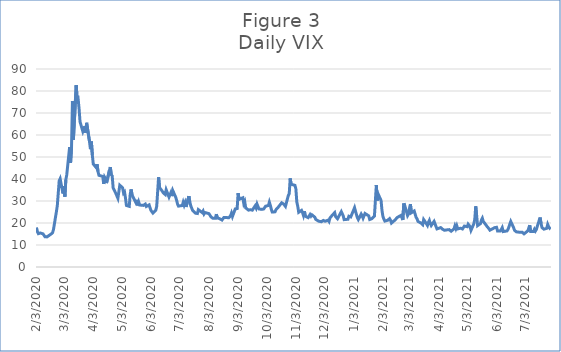
| Category | Series 0 |
|---|---|
| 2/3/20 | 17.97 |
| 2/4/20 | 16.05 |
| 2/5/20 | 15.15 |
| 2/6/20 | 14.96 |
| 2/7/20 | 15.47 |
| 2/10/20 | 15.04 |
| 2/11/20 | 15.18 |
| 2/12/20 | 13.74 |
| 2/13/20 | 14.15 |
| 2/14/20 | 13.68 |
| 2/18/20 | 14.83 |
| 2/19/20 | 14.38 |
| 2/20/20 | 15.56 |
| 2/21/20 | 17.08 |
| 2/24/20 | 25.03 |
| 2/25/20 | 27.85 |
| 2/26/20 | 27.56 |
| 2/27/20 | 39.16 |
| 2/28/20 | 40.11 |
| 3/2/20 | 33.42 |
| 3/3/20 | 36.82 |
| 3/4/20 | 31.99 |
| 3/5/20 | 39.62 |
| 3/6/20 | 41.94 |
| 3/9/20 | 54.46 |
| 3/10/20 | 47.3 |
| 3/11/20 | 53.9 |
| 3/12/20 | 75.47 |
| 3/13/20 | 57.83 |
| 3/16/20 | 82.69 |
| 3/17/20 | 75.91 |
| 3/18/20 | 76.45 |
| 3/19/20 | 72 |
| 3/20/20 | 66.04 |
| 3/23/20 | 61.59 |
| 3/24/20 | 61.67 |
| 3/25/20 | 63.95 |
| 3/26/20 | 61 |
| 3/27/20 | 65.54 |
| 3/30/20 | 57.08 |
| 3/31/20 | 53.54 |
| 4/1/20 | 57.06 |
| 4/2/20 | 50.91 |
| 4/3/20 | 46.8 |
| 4/6/20 | 45.24 |
| 4/7/20 | 46.7 |
| 4/8/20 | 43.35 |
| 4/9/20 | 41.67 |
| 4/13/20 | 41.17 |
| 4/14/20 | 37.76 |
| 4/15/20 | 40.84 |
| 4/16/20 | 40.11 |
| 4/17/20 | 38.15 |
| 4/20/20 | 43.83 |
| 4/21/20 | 45.41 |
| 4/22/20 | 41.98 |
| 4/23/20 | 41.38 |
| 4/24/20 | 35.93 |
| 4/27/20 | 33.29 |
| 4/28/20 | 33.57 |
| 4/29/20 | 31.23 |
| 4/30/20 | 34.15 |
| 5/1/20 | 37.19 |
| 5/4/20 | 35.97 |
| 5/5/20 | 33.61 |
| 5/6/20 | 34.12 |
| 5/7/20 | 31.44 |
| 5/8/20 | 27.98 |
| 5/11/20 | 27.57 |
| 5/12/20 | 33.04 |
| 5/13/20 | 35.28 |
| 5/14/20 | 32.61 |
| 5/15/20 | 31.89 |
| 5/18/20 | 29.3 |
| 5/19/20 | 30.53 |
| 5/20/20 | 27.99 |
| 5/21/20 | 29.53 |
| 5/22/20 | 28.16 |
| 5/26/20 | 28.01 |
| 5/27/20 | 27.62 |
| 5/28/20 | 28.59 |
| 5/29/20 | 27.51 |
| 6/1/20 | 28.23 |
| 6/2/20 | 26.84 |
| 6/3/20 | 25.66 |
| 6/4/20 | 25.81 |
| 6/5/20 | 24.52 |
| 6/8/20 | 25.81 |
| 6/9/20 | 27.57 |
| 6/10/20 | 27.57 |
| 6/11/20 | 40.79 |
| 6/12/20 | 36.09 |
| 6/15/20 | 34.4 |
| 6/16/20 | 33.67 |
| 6/17/20 | 33.47 |
| 6/18/20 | 32.94 |
| 6/19/20 | 35.12 |
| 6/22/20 | 31.77 |
| 6/23/20 | 31.37 |
| 6/24/20 | 33.84 |
| 6/25/20 | 32.22 |
| 6/26/20 | 34.73 |
| 6/29/20 | 31.78 |
| 6/30/20 | 30.43 |
| 7/1/20 | 28.62 |
| 7/2/20 | 27.68 |
| 7/6/20 | 27.94 |
| 7/7/20 | 29.43 |
| 7/8/20 | 28.08 |
| 7/9/20 | 29.26 |
| 7/10/20 | 27.29 |
| 7/13/20 | 32.19 |
| 7/14/20 | 29.52 |
| 7/15/20 | 27.76 |
| 7/16/20 | 28 |
| 7/17/20 | 25.68 |
| 7/20/20 | 24.46 |
| 7/21/20 | 24.84 |
| 7/22/20 | 24.32 |
| 7/23/20 | 26.08 |
| 7/24/20 | 25.84 |
| 7/27/20 | 24.74 |
| 7/28/20 | 25.44 |
| 7/29/20 | 24.1 |
| 7/30/20 | 24.76 |
| 7/31/20 | 24.46 |
| 8/3/20 | 24.28 |
| 8/4/20 | 23.76 |
| 8/5/20 | 22.99 |
| 8/6/20 | 22.65 |
| 8/7/20 | 22.21 |
| 8/10/20 | 22.13 |
| 8/11/20 | 24.03 |
| 8/12/20 | 22.28 |
| 8/13/20 | 22.13 |
| 8/14/20 | 22.05 |
| 8/17/20 | 21.35 |
| 8/18/20 | 21.51 |
| 8/19/20 | 22.54 |
| 8/20/20 | 22.72 |
| 8/21/20 | 22.54 |
| 8/24/20 | 22.37 |
| 8/25/20 | 22.03 |
| 8/26/20 | 23.27 |
| 8/27/20 | 24.47 |
| 8/28/20 | 22.96 |
| 8/31/20 | 26.41 |
| 9/1/20 | 26.12 |
| 9/2/20 | 26.57 |
| 9/3/20 | 33.6 |
| 9/4/20 | 30.75 |
| 9/8/20 | 31.46 |
| 9/9/20 | 28.81 |
| 9/10/20 | 29.71 |
| 9/11/20 | 26.87 |
| 9/14/20 | 25.85 |
| 9/15/20 | 25.59 |
| 9/16/20 | 26.04 |
| 9/17/20 | 26.46 |
| 9/18/20 | 25.83 |
| 9/21/20 | 27.78 |
| 9/22/20 | 26.86 |
| 9/23/20 | 28.58 |
| 9/24/20 | 28.51 |
| 9/25/20 | 26.38 |
| 9/28/20 | 26.19 |
| 9/29/20 | 26.27 |
| 9/30/20 | 26.37 |
| 10/1/20 | 26.7 |
| 10/2/20 | 27.63 |
| 10/5/20 | 27.96 |
| 10/6/20 | 29.48 |
| 10/7/20 | 28.06 |
| 10/8/20 | 26.36 |
| 10/9/20 | 25 |
| 10/12/20 | 25.07 |
| 10/13/20 | 26.07 |
| 10/14/20 | 26.4 |
| 10/15/20 | 26.97 |
| 10/16/20 | 27.41 |
| 10/19/20 | 29.18 |
| 10/20/20 | 29.35 |
| 10/21/20 | 28.65 |
| 10/22/20 | 28.11 |
| 10/23/20 | 27.55 |
| 10/26/20 | 32.46 |
| 10/27/20 | 33.35 |
| 10/28/20 | 40.28 |
| 10/29/20 | 37.59 |
| 10/30/20 | 38.02 |
| 11/2/20 | 37.13 |
| 11/3/20 | 35.55 |
| 11/4/20 | 29.57 |
| 11/5/20 | 27.58 |
| 11/6/20 | 24.86 |
| 11/9/20 | 25.75 |
| 11/10/20 | 24.8 |
| 11/11/20 | 23.45 |
| 11/12/20 | 25.35 |
| 11/13/20 | 23.1 |
| 11/16/20 | 22.45 |
| 11/17/20 | 22.71 |
| 11/18/20 | 23.84 |
| 11/19/20 | 23.11 |
| 11/20/20 | 23.7 |
| 11/23/20 | 22.66 |
| 11/24/20 | 21.64 |
| 11/25/20 | 21.25 |
| 11/27/20 | 20.84 |
| 11/30/20 | 20.57 |
| 12/1/20 | 20.77 |
| 12/2/20 | 21.17 |
| 12/3/20 | 21.28 |
| 12/4/20 | 20.79 |
| 12/7/20 | 21.3 |
| 12/8/20 | 20.68 |
| 12/9/20 | 22.27 |
| 12/10/20 | 22.52 |
| 12/11/20 | 23.31 |
| 12/14/20 | 24.72 |
| 12/15/20 | 22.89 |
| 12/16/20 | 22.5 |
| 12/17/20 | 21.93 |
| 12/18/20 | 21.57 |
| 12/21/20 | 25.16 |
| 12/22/20 | 24.23 |
| 12/23/20 | 23.31 |
| 12/24/20 | 21.53 |
| 12/28/20 | 21.7 |
| 12/29/20 | 23.08 |
| 12/30/20 | 22.77 |
| 12/31/20 | 22.75 |
| 1/4/21 | 26.97 |
| 1/5/21 | 25.34 |
| 1/6/21 | 25.07 |
| 1/7/21 | 22.37 |
| 1/8/21 | 21.56 |
| 1/11/21 | 24.08 |
| 1/12/21 | 23.33 |
| 1/13/21 | 22.21 |
| 1/14/21 | 23.25 |
| 1/15/21 | 24.34 |
| 1/19/21 | 23.24 |
| 1/20/21 | 21.58 |
| 1/21/21 | 21.32 |
| 1/22/21 | 21.91 |
| 1/25/21 | 23.19 |
| 1/26/21 | 23.02 |
| 1/27/21 | 37.21 |
| 1/28/21 | 30.21 |
| 1/29/21 | 33.09 |
| 2/1/21 | 30.24 |
| 2/2/21 | 25.56 |
| 2/3/21 | 22.91 |
| 2/4/21 | 21.77 |
| 2/5/21 | 20.87 |
| 2/8/21 | 21.24 |
| 2/9/21 | 21.63 |
| 2/10/21 | 21.99 |
| 2/11/21 | 21.25 |
| 2/12/21 | 19.97 |
| 2/16/21 | 21.46 |
| 2/17/21 | 21.5 |
| 2/18/21 | 22.49 |
| 2/19/21 | 22.05 |
| 2/22/21 | 23.45 |
| 2/23/21 | 23.11 |
| 2/24/21 | 21.34 |
| 2/25/21 | 28.89 |
| 2/26/21 | 27.95 |
| 3/1/21 | 23.35 |
| 3/2/21 | 24.1 |
| 3/3/21 | 26.67 |
| 3/4/21 | 28.57 |
| 3/5/21 | 24.66 |
| 3/8/21 | 25.47 |
| 3/9/21 | 24.03 |
| 3/10/21 | 22.56 |
| 3/11/21 | 21.91 |
| 3/12/21 | 20.69 |
| 3/15/21 | 20.03 |
| 3/16/21 | 19.79 |
| 3/17/21 | 19.23 |
| 3/18/21 | 21.58 |
| 3/19/21 | 20.95 |
| 3/22/21 | 18.88 |
| 3/23/21 | 20.3 |
| 3/24/21 | 21.2 |
| 3/25/21 | 19.81 |
| 3/26/21 | 18.86 |
| 3/29/21 | 20.74 |
| 3/30/21 | 19.61 |
| 3/31/21 | 19.4 |
| 4/1/21 | 17.33 |
| 4/5/21 | 17.91 |
| 4/6/21 | 18.12 |
| 4/7/21 | 17.16 |
| 4/8/21 | 16.95 |
| 4/9/21 | 16.69 |
| 4/12/21 | 16.91 |
| 4/13/21 | 16.65 |
| 4/14/21 | 16.99 |
| 4/15/21 | 16.57 |
| 4/16/21 | 16.25 |
| 4/19/21 | 17.29 |
| 4/20/21 | 18.68 |
| 4/21/21 | 17.5 |
| 4/22/21 | 18.71 |
| 4/23/21 | 17.33 |
| 4/26/21 | 17.64 |
| 4/27/21 | 17.56 |
| 4/28/21 | 17.28 |
| 4/29/21 | 17.61 |
| 4/30/21 | 18.61 |
| 5/3/21 | 18.31 |
| 5/4/21 | 19.48 |
| 5/5/21 | 19.15 |
| 5/6/21 | 18.39 |
| 5/7/21 | 16.69 |
| 5/10/21 | 19.66 |
| 5/11/21 | 21.84 |
| 5/12/21 | 27.59 |
| 5/13/21 | 23.13 |
| 5/14/21 | 18.81 |
| 5/17/21 | 19.72 |
| 5/18/21 | 21.34 |
| 5/19/21 | 22.18 |
| 5/20/21 | 20.67 |
| 5/21/21 | 20.15 |
| 5/24/21 | 18.4 |
| 5/25/21 | 18.84 |
| 5/26/21 | 17.36 |
| 5/27/21 | 16.74 |
| 5/28/21 | 16.76 |
| 6/1/21 | 17.9 |
| 6/2/21 | 17.48 |
| 6/3/21 | 18.04 |
| 6/4/21 | 16.42 |
| 6/7/21 | 16.42 |
| 6/8/21 | 17.07 |
| 6/9/21 | 17.89 |
| 6/10/21 | 16.1 |
| 6/11/21 | 15.65 |
| 6/14/21 | 16.39 |
| 6/15/21 | 17.02 |
| 6/16/21 | 18.15 |
| 6/17/21 | 17.75 |
| 6/18/21 | 20.7 |
| 6/21/21 | 17.89 |
| 6/22/21 | 16.66 |
| 6/23/21 | 16.32 |
| 6/24/21 | 15.97 |
| 6/25/21 | 15.62 |
| 6/28/21 | 15.76 |
| 6/29/21 | 16.02 |
| 6/30/21 | 15.83 |
| 7/1/21 | 15.48 |
| 7/2/21 | 15.07 |
| 7/6/21 | 16.44 |
| 7/7/21 | 16.2 |
| 7/8/21 | 19 |
| 7/9/21 | 16.18 |
| 7/12/21 | 16.17 |
| 7/13/21 | 17.12 |
| 7/14/21 | 16.33 |
| 7/15/21 | 17.01 |
| 7/16/21 | 18.45 |
| 7/19/21 | 22.5 |
| 7/20/21 | 19.73 |
| 7/21/21 | 17.91 |
| 7/22/21 | 17.69 |
| 7/23/21 | 17.2 |
| 7/26/21 | 17.58 |
| 7/27/21 | 19.36 |
| 7/28/21 | 18.31 |
| 7/29/21 | 17.7 |
| 7/30/21 | 18.24 |